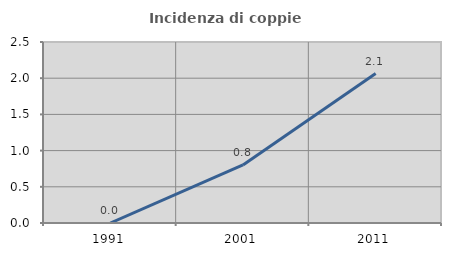
| Category | Incidenza di coppie miste |
|---|---|
| 1991.0 | 0 |
| 2001.0 | 0.802 |
| 2011.0 | 2.064 |